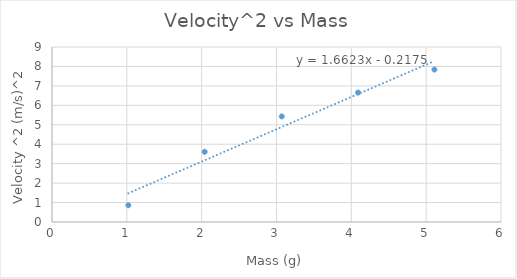
| Category | Series 0 |
|---|---|
| 1.02 | 0.861 |
| 2.04 | 3.61 |
| 3.07 | 5.429 |
| 4.09 | 6.656 |
| 5.11 | 7.84 |